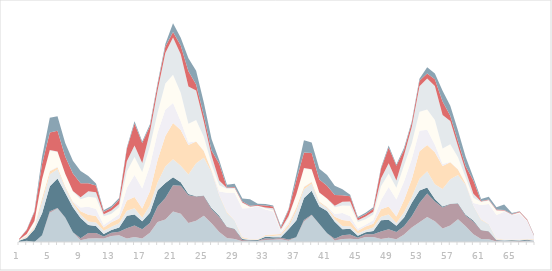
| Category | Продажи | Маркетинг | Производство | Логистика | Техслужба | ИТ | Финансы | Бухгалтерия | Безопасность | Управление |
|---|---|---|---|---|---|---|---|---|---|---|
| 1.0 | 0 | 0 | 97 | 24 | 6 | 10 | 25 | 7 | 62 | 7 |
| nan | 95 | 0 | 211 | 65 | 75 | 78 | 64 | 37 | 298 | 56 |
| nan | 0 | 0 | 979 | 74 | 86 | 106 | 319 | 75 | 685 | 87 |
| nan | 532 | 0 | 1708 | 890 | 273 | 78 | 1364 | 37 | 1196 | 563 |
| 5.0 | 2273 | 118 | 1943 | 930 | 218 | 51 | 1556 | 42 | 1360 | 1156 |
| nan | 2593 | 53 | 2282 | 723 | 153 | 48 | 1132 | 43 | 1597 | 1123 |
| nan | 1887 | 20 | 1920 | 376 | 120 | 2 | 960 | 14 | 1344 | 1046 |
| nan | 755 | 9 | 1940 | 271 | 109 | 84 | 755 | 42 | 1358 | 985 |
| 9.0 | 137 | 163 | 1559 | 259 | 263 | 292 | 637 | 163 | 1091 | 950 |
| nan | 276 | 418 | 625 | 272 | 518 | 625 | 776 | 418 | 625 | 567 |
| nan | 287 | 419 | 531 | 268 | 519 | 531 | 887 | 419 | 531 | 156 |
| nan | 276 | 145 | 198 | 263 | 245 | 198 | 676 | 145 | 198 | 111 |
| 13.0 | 472 | 249 | 203 | 253 | 349 | 203 | 472 | 249 | 203 | 135 |
| nan | 532 | 261 | 332 | 337 | 361 | 332 | 532 | 261 | 332 | 138 |
| nan | 273 | 793 | 979 | 376 | 793 | 979 | 1273 | 793 | 979 | 103 |
| nan | 393 | 881 | 854 | 487 | 881 | 1708 | 1393 | 881 | 1708 | 188 |
| 17.0 | 276 | 717 | 617 | 276 | 717 | 1543 | 1276 | 717 | 1543 | 106 |
| nan | 718 | 762 | 793 | 572 | 1089 | 1982 | 1518 | 1089 | 462 | 157 |
| nan | 1549 | 1212 | 1248 | 632 | 1731 | 2120 | 1549 | 1731 | 447 | 131 |
| nan | 1749 | 1658 | 1176 | 1273 | 2369 | 2040 | 2033 | 2369 | 490 | 197 |
| 21.0 | 2376 | 2032 | 624 | 1393 | 2803 | 1559 | 2182 | 2903 | 429 | 674 |
| nan | 2200 | 2160 | 273 | 1276 | 2786 | 683 | 2200 | 2986 | 683 | 603 |
| nan | 1465 | 2162 | 98 | 1518 | 2289 | 180 | 1465 | 2889 | 1180 | 1010 |
| nan | 1643 | 1885 | 30 | 2549 | 1693 | 17 | 1643 | 2293 | 471 | 1058 |
| 25.0 | 2035 | 1525 | 50 | 2933 | 525 | 55 | 1035 | 1178 | 483 | 1012 |
| nan | 1462 | 1075 | 99 | 2802 | 90 | 79 | 462 | 635 | 400 | 886 |
| nan | 769 | 1168 | 97 | 1600 | 41 | 246 | 490 | 368 | 1283 | 287 |
| nan | 303 | 855 | 33 | 1065 | 74 | 1499 | 294 | 57 | 40 | 219 |
| 29.0 | 238 | 743 | 40 | 643 | 15 | 2122 | 353 | 64 | 56 | 241 |
| nan | 59 | 96 | 69 | 75 | 81 | 2211 | 434 | 37 | 71 | 240 |
| nan | 90 | 19 | 41 | 62 | 24 | 2400 | 51 | 67 | 53 | 512 |
| nan | 80 | 19 | 64 | 5 | 37 | 2561 | 20 | 29 | 61 | 85 |
| 33.0 | 163 | 122 | 126 | 68 | 67 | 1983 | 84 | 72 | 149 | 123 |
| nan | 178 | 75 | 117 | 94 | 120 | 1783 | 93 | 158 | 130 | 81 |
| nan | 213 | 122 | 42 | 168 | 72 | 157 | 94 | 132 | 130 | 115 |
| nan | 88 | 98 | 796 | 179 | 204 | 179 | 313 | 167 | 466 | 68 |
| 37.0 | 373 | 0 | 1299 | 739 | 222 | 68 | 955 | 30 | 1077 | 445 |
| nan | 1592 | 106 | 1710 | 679 | 179 | 42 | 1401 | 36 | 1197 | 960 |
| nan | 2075 | 46 | 1849 | 550 | 132 | 36 | 917 | 38 | 1262 | 820 |
| nan | 1378 | 15 | 1364 | 290 | 89 | 2 | 682 | 13 | 1022 | 827 |
| 41.0 | 672 | 7 | 1727 | 209 | 87 | 59 | 582 | 34 | 978 | 838 |
| nan | 109 | 144 | 1326 | 195 | 185 | 208 | 529 | 115 | 841 | 713 |
| nan | 227 | 301 | 469 | 243 | 467 | 544 | 575 | 297 | 507 | 465 |
| nan | 244 | 336 | 447 | 201 | 405 | 372 | 799 | 332 | 404 | 130 |
| 45.0 | 219 | 109 | 149 | 187 | 204 | 165 | 514 | 131 | 173 | 83 |
| nan | 392 | 217 | 149 | 180 | 262 | 147 | 421 | 212 | 173 | 122 |
| nan | 394 | 201 | 259 | 263 | 304 | 273 | 431 | 222 | 233 | 115 |
| nan | 227 | 579 | 882 | 275 | 579 | 705 | 1070 | 619 | 754 | 89 |
| 49.0 | 335 | 652 | 743 | 405 | 617 | 1521 | 1045 | 793 | 1213 | 170 |
| nan | 216 | 553 | 494 | 219 | 502 | 1312 | 906 | 567 | 1142 | 94 |
| nan | 589 | 641 | 675 | 407 | 948 | 1428 | 1276 | 785 | 416 | 142 |
| nan | 1116 | 885 | 1036 | 456 | 1385 | 1569 | 1224 | 1247 | 331 | 118 |
| 53.0 | 1540 | 1493 | 953 | 917 | 2133 | 1592 | 1485 | 1967 | 437 | 140 |
| nan | 1949 | 1809 | 468 | 1254 | 2047 | 1185 | 1572 | 2410 | 378 | 486 |
| nan | 1606 | 1534 | 200 | 1136 | 2480 | 581 | 1936 | 2628 | 526 | 453 |
| nan | 1055 | 1622 | 75 | 1367 | 1786 | 155 | 1187 | 2601 | 1051 | 839 |
| 57.0 | 1282 | 1659 | 21 | 1912 | 1321 | 14 | 1381 | 1789 | 410 | 773 |
| nan | 1771 | 1190 | 37 | 2200 | 420 | 47 | 911 | 849 | 392 | 840 |
| nan | 1229 | 817 | 72 | 2326 | 77 | 59 | 416 | 528 | 348 | 727 |
| nan | 593 | 993 | 81 | 1136 | 37 | 192 | 407 | 302 | 1040 | 233 |
| 61.0 | 231 | 676 | 28 | 767 | 56 | 1110 | 227 | 47 | 30 | 167 |
| nan | 210 | 602 | 30 | 534 | 14 | 1550 | 265 | 54 | 42 | 201 |
| nan | 43 | 71 | 49 | 53 | 60 | 1814 | 348 | 31 | 61 | 171 |
| nan | 68 | 16 | 32 | 53 | 22 | 2160 | 39 | 49 | 45 | 431 |
| 65.0 | 56 | 16 | 57 | 4 | 32 | 1921 | 15 | 26 | 51 | 75 |
| nan | 9 | 48 | 64 | 44 | 23 | 2007 | 67 | 43 | 70 | 5 |
| nan | 73 | 43 | 59 | 37 | 47 | 1375 | 19 | 23 | 51 | 22 |
| nan | 64 | 18 | 10 | 73 | 38 | 54 | 10 | 40 | 36 | 46 |